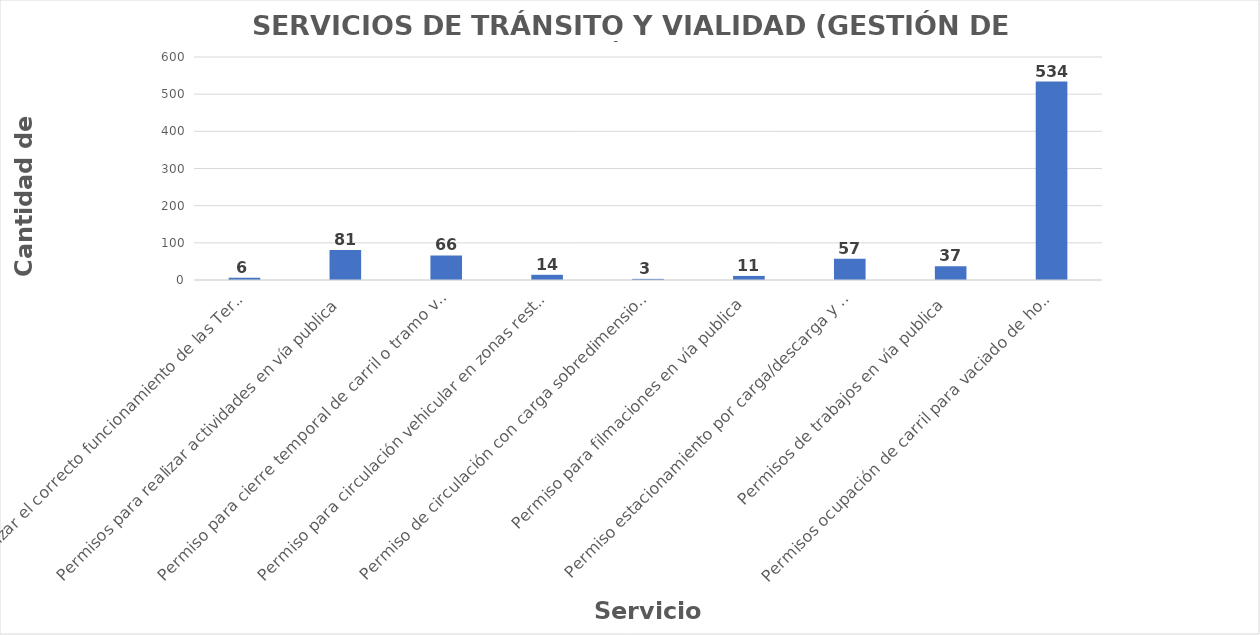
| Category | Series 0 |
|---|---|
| Garantizar el correcto funcionamiento de las Terminales privadas de pasajeros.  | 6 |
| Permisos para realizar actividades en vía publica | 81 |
| Permiso para cierre temporal de carril o tramo vial | 66 |
| Permiso para circulación vehicular en zonas restringidas | 14 |
| Permiso de circulación con carga sobredimensionada | 3 |
| Permiso para filmaciones en vía publica | 11 |
| Permiso estacionamiento por carga/descarga y otros | 57 |
| Permisos de trabajos en vía publica | 37 |
| Permisos ocupación de carril para vaciado de hormigón | 534 |